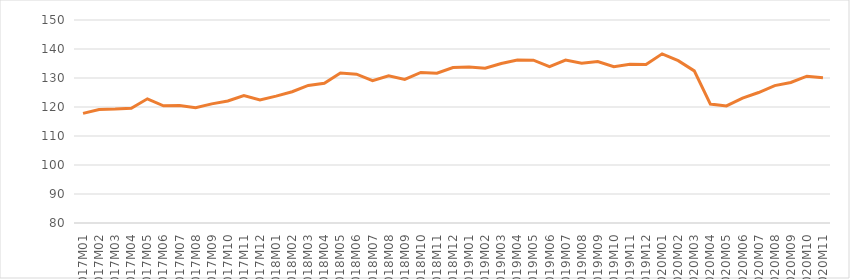
| Category | Säsongrensat |
|---|---|
| 2017M01 | 117.8 |
| 2017M02 | 119.147 |
| 2017M03 | 119.269 |
| 2017M04 | 119.581 |
| 2017M05 | 122.822 |
| 2017M06 | 120.428 |
| 2017M07 | 120.52 |
| 2017M08 | 119.746 |
| 2017M09 | 121.076 |
| 2017M10 | 122.064 |
| 2017M11 | 123.968 |
| 2017M12 | 122.407 |
| 2018M01 | 123.758 |
| 2018M02 | 125.276 |
| 2018M03 | 127.436 |
| 2018M04 | 128.19 |
| 2018M05 | 131.695 |
| 2018M06 | 131.331 |
| 2018M07 | 129.07 |
| 2018M08 | 130.794 |
| 2018M09 | 129.514 |
| 2018M10 | 131.923 |
| 2018M11 | 131.676 |
| 2018M12 | 133.614 |
| 2019M01 | 133.774 |
| 2019M02 | 133.348 |
| 2019M03 | 135.02 |
| 2019M04 | 136.194 |
| 2019M05 | 136.161 |
| 2019M06 | 133.935 |
| 2019M07 | 136.199 |
| 2019M08 | 135.131 |
| 2019M09 | 135.658 |
| 2019M10 | 133.895 |
| 2019M11 | 134.72 |
| 2019M12 | 134.672 |
| 2020M01 | 138.326 |
| 2020M02 | 135.968 |
| 2020M03 | 132.454 |
| 2020M04 | 120.995 |
| 2020M05 | 120.376 |
| 2020M06 | 123.042 |
| 2020M07 | 124.986 |
| 2020M08 | 127.378 |
| 2020M09 | 128.455 |
| 2020M10 | 130.632 |
| 2020M11 | 130.07 |